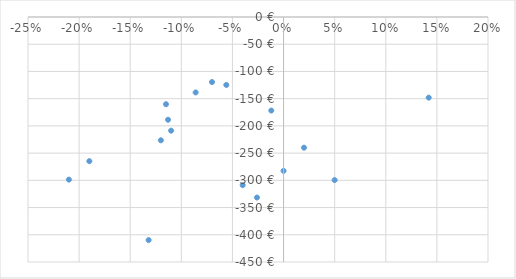
| Category | Series 0 |
|---|---|
| 0.14200000000000002 | -148.106 |
| -0.11299999999999999 | -188.758 |
| -0.11499999999999999 | -160.183 |
| -0.11999999999999997 | -226.479 |
| -0.18999999999999997 | -264.788 |
| -0.04000000000000001 | -308.888 |
| -0.21000000000000002 | -298.691 |
| -0.07 | -119.498 |
| 0.020000000000000018 | -240 |
| 0.0 | -282.503 |
| 0.04999999999999999 | -299.592 |
| -0.10999999999999999 | -208.782 |
| -0.086 | -138.556 |
| -0.02600000000000008 | -331.583 |
| -0.011999999999999983 | -171.836 |
| -0.132 | -409.761 |
| -0.05600000000000002 | -124.741 |